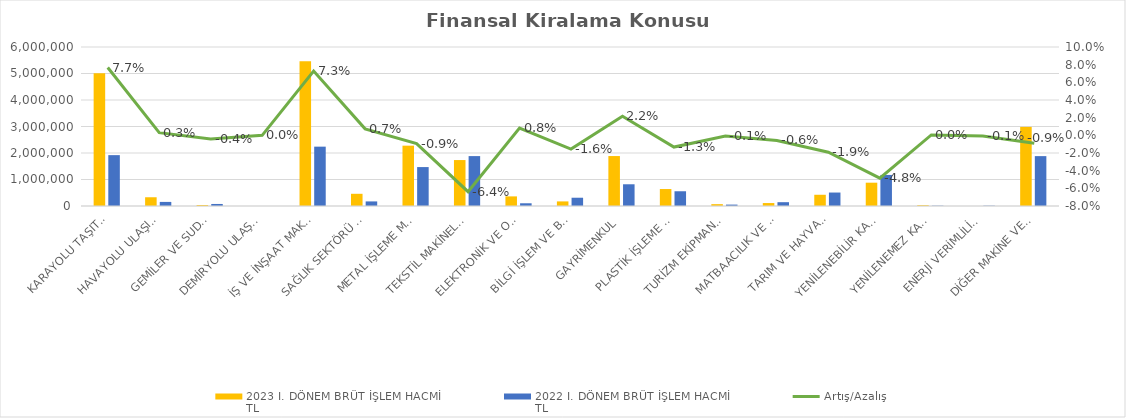
| Category | 2023 I. DÖNEM BRÜT İŞLEM HACMİ 
TL | 2022 I. DÖNEM BRÜT İŞLEM HACMİ 
TL |
|---|---|---|
| KARAYOLU TAŞITLARI | 5011089.681 | 1919451.275 |
| HAVAYOLU ULAŞIM ARAÇLARI | 330000 | 154435 |
| GEMİLER VE SUDA YÜZEN TAŞIT VE ARAÇLAR | 37098.982 | 76669 |
| DEMİRYOLU ULAŞIM ARAÇLARI | 0 | 0 |
| İŞ VE İNŞAAT MAKİNELERİ | 5462261.128 | 2239554.344 |
| SAĞLIK SEKTÖRÜ VE ESTETİK EKİPMANLARI | 460659.256 | 172860.711 |
| METAL İŞLEME MAKİNELERİ | 2276551.444 | 1468984.044 |
| TEKSTİL MAKİNELERİ | 1733707.016 | 1883319.779 |
| ELEKTRONİK VE OPTİK CİHAZLAR | 362848.208 | 102963.667 |
| BİLGİ İŞLEM VE BÜRO SİSTEMLERİ | 173431.507 | 312224.365 |
| GAYRİMENKUL | 1884908.358 | 819868.423 |
| PLASTİK İŞLEME MAKİNELERİ | 640082.712 | 556428.832 |
| TURİZM EKİPMANLARI | 69297.365 | 52656.719 |
| MATBAACILIK VE KAĞIT İŞLEME MAKİNELERİ | 111359.098 | 143880.669 |
| TARIM VE HAYVANCILIK MAKİNELERİ | 423913.835 | 508036.8 |
| YENİLENEBİLİR KAYNAKLI ELEKTRİK ENERJİSİ ÜRETİM EKİPMANLARI | 879491.735 | 1171947.614 |
| YENİLENEMEZ KAYNAKLI ELEKTRİK ENERJİSİ ÜRETİM EKİPMANLARI | 29859 | 11337 |
| ENERJİ VERİMLİLİĞİ EKİPMANLARI | 0 | 11273.342 |
| DİĞER MAKİNE VE EKİPMANLAR | 2985144.813 | 1882207.155 |